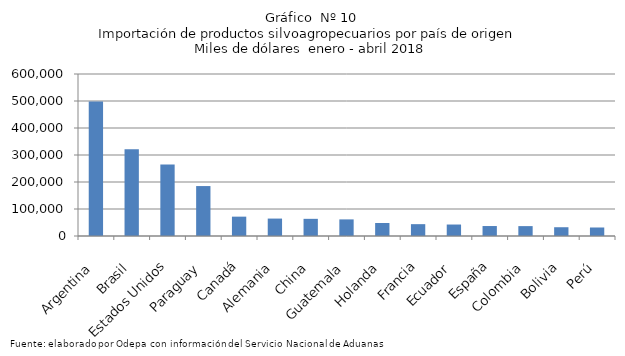
| Category | Series 0 |
|---|---|
| Argentina | 498131.209 |
| Brasil | 320847.92 |
| Estados Unidos | 265062.05 |
| Paraguay | 184978.842 |
| Canadá | 71670.191 |
| Alemania | 64541.677 |
| China | 63568.491 |
| Guatemala | 61484.439 |
| Holanda | 48216.244 |
| Francia | 43860.622 |
| Ecuador | 42492.638 |
| España | 36925.827 |
| Colombia | 36629.916 |
| Bolivia | 32482.354 |
| Perú | 31507.567 |